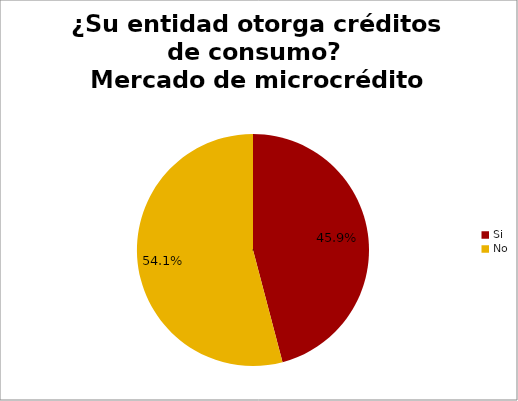
| Category | ¿Su entidad otorga créditos de consumo? Mercado de microcrédito |
|---|---|
| Si | 0.459 |
| No | 0.541 |